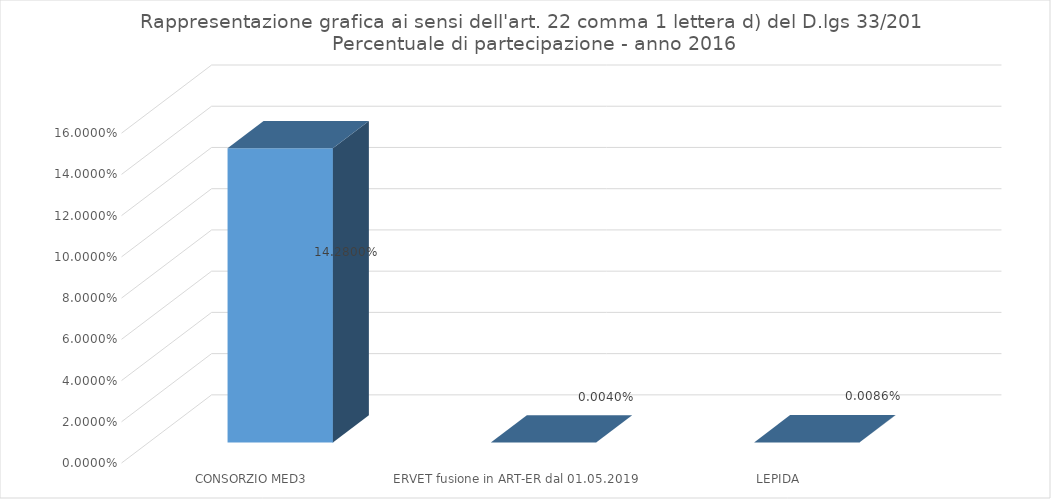
| Category | Series 0 |
|---|---|
| CONSORZIO MED3 | 0.143 |
| ERVET fusione in ART-ER dal 01.05.2019 | 0 |
| LEPIDA | 0 |